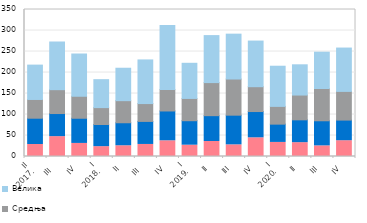
| Category | Микропредузећа | Мала | Средња | Велика |
|---|---|---|---|---|
| II
2017. | 28.601 | 62.573 | 44.608 | 81.806 |
| III  | 47.306 | 54.987 | 56.8 | 113.518 |
| IV | 31.129 | 59.946 | 52.372 | 100.581 |
| I
2018. | 23.458 | 52.774 | 40.183 | 66.517 |
| II | 25.544 | 54.802 | 52.603 | 77.229 |
| III  | 28.673 | 54.873 | 42.484 | 103.899 |
| IV | 37.41 | 70.984 | 51.038 | 152.215 |
| I
2019. | 26.913 | 58.293 | 53.033 | 83.702 |
| II | 35.763 | 61.475 | 78.723 | 111.897 |
| III | 27.759 | 70.634 | 86.103 | 106.825 |
| IV | 44.489 | 62.561 | 59.132 | 108.665 |
| I
2020. | 33.497 | 43.549 | 42.255 | 95.672 |
| II | 32.96 | 54.335 | 59 | 72.028 |
| III | 25.293 | 59.78 | 76.792 | 86.501 |
| IV | 37.626 | 49.063 | 68.305 | 103.2 |